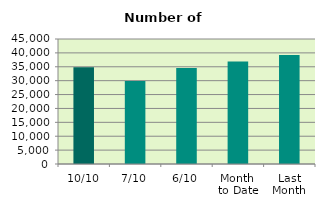
| Category | Series 0 |
|---|---|
| 10/10 | 34874 |
| 7/10 | 29904 |
| 6/10 | 34590 |
| Month 
to Date | 36873.333 |
| Last
Month | 39229.818 |